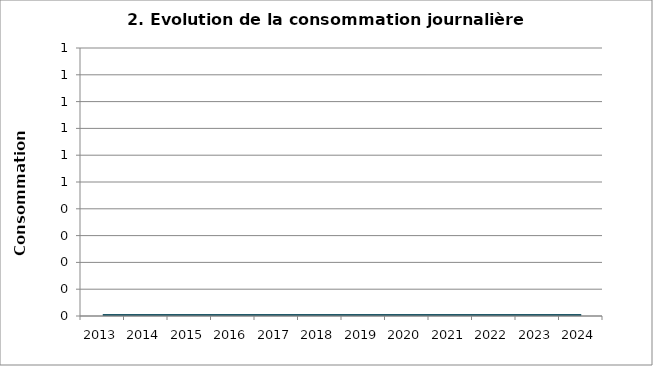
| Category | Consommation |
|---|---|
| 2013.0 | 0 |
| 2014.0 | 0 |
| 2015.0 | 0 |
| 2016.0 | 0 |
| 2017.0 | 0 |
| 2018.0 | 0 |
| 2019.0 | 0 |
| 2020.0 | 0 |
| 2021.0 | 0 |
| 2022.0 | 0 |
| 2023.0 | 0 |
| 2024.0 | 0 |